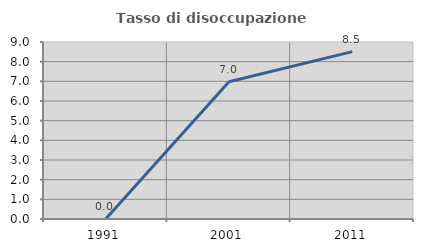
| Category | Tasso di disoccupazione giovanile  |
|---|---|
| 1991.0 | 0 |
| 2001.0 | 6.977 |
| 2011.0 | 8.511 |